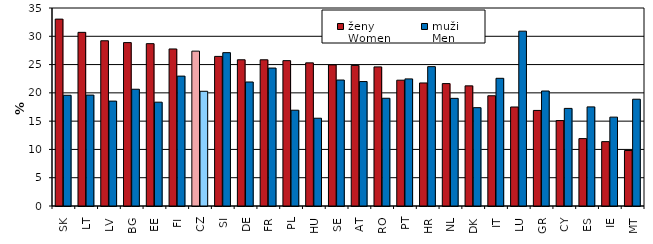
| Category | ženy
Women | muži
Men |
|---|---|---|
| SK | 33.035 | 19.571 |
| LT | 30.694 | 19.608 |
| LV | 29.206 | 18.543 |
| BG | 28.882 | 20.639 |
| EE | 28.699 | 18.351 |
| FI | 27.76 | 22.958 |
| CZ | 27.376 | 20.278 |
| SI | 26.445 | 27.107 |
| DE | 25.848 | 21.921 |
| FR | 25.846 | 24.384 |
| PL | 25.695 | 16.933 |
| HU | 25.302 | 15.516 |
| SE | 24.941 | 22.27 |
| AT | 24.852 | 21.998 |
| RO | 24.59 | 19.045 |
| PT | 22.239 | 22.467 |
| HR | 21.751 | 24.636 |
| NL | 21.635 | 19.029 |
| DK | 21.235 | 17.383 |
| IT | 19.486 | 22.572 |
| LU | 17.5 | 30.907 |
| GR | 16.893 | 20.328 |
| CY | 15.1 | 17.252 |
| ES | 11.914 | 17.522 |
| IE | 11.379 | 15.71 |
| MT | 9.804 | 18.875 |